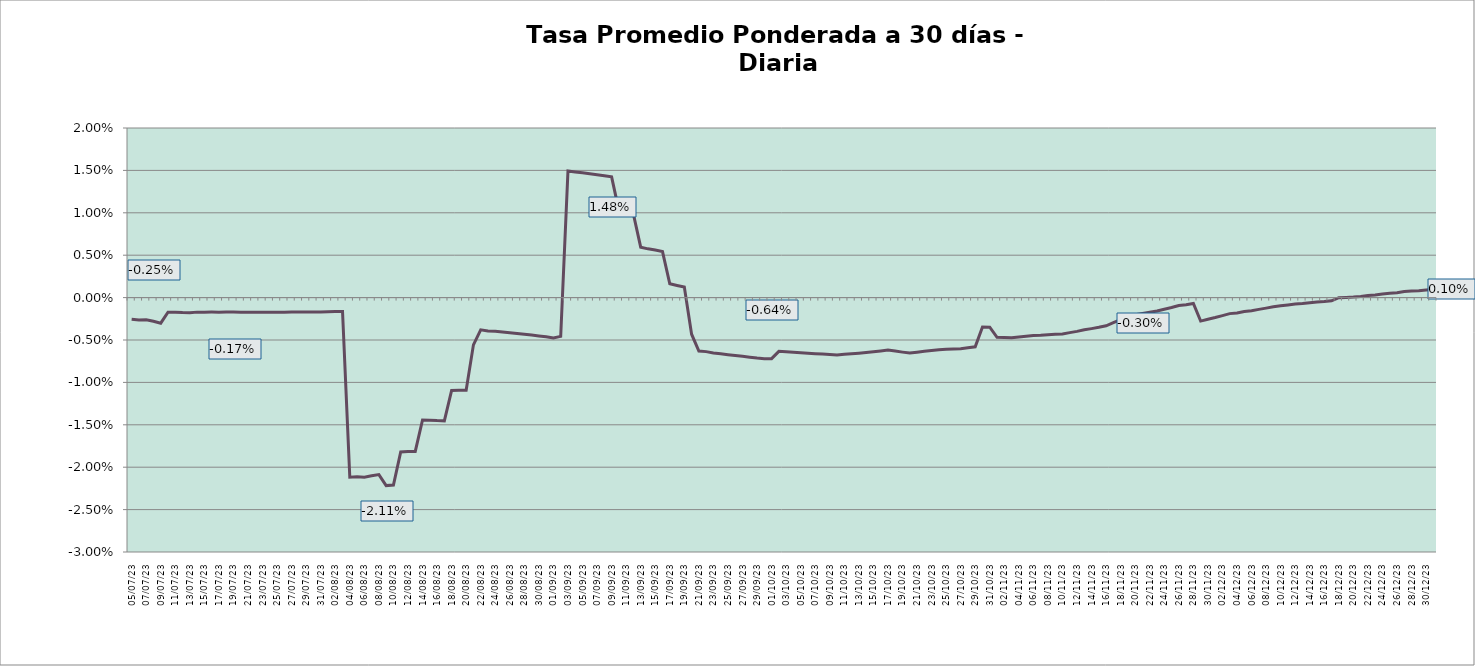
| Category | Tasa a 30 días |
|---|---|
| 2023-07-05 | -0.003 |
| 2023-07-06 | -0.003 |
| 2023-07-07 | -0.003 |
| 2023-07-08 | -0.003 |
| 2023-07-09 | -0.003 |
| 2023-07-10 | -0.002 |
| 2023-07-11 | -0.002 |
| 2023-07-12 | -0.002 |
| 2023-07-13 | -0.002 |
| 2023-07-14 | -0.002 |
| 2023-07-15 | -0.002 |
| 2023-07-16 | -0.002 |
| 2023-07-17 | -0.002 |
| 2023-07-18 | -0.002 |
| 2023-07-19 | -0.002 |
| 2023-07-20 | -0.002 |
| 2023-07-21 | -0.002 |
| 2023-07-22 | -0.002 |
| 2023-07-23 | -0.002 |
| 2023-07-24 | -0.002 |
| 2023-07-25 | -0.002 |
| 2023-07-26 | -0.002 |
| 2023-07-27 | -0.002 |
| 2023-07-28 | -0.002 |
| 2023-07-29 | -0.002 |
| 2023-07-30 | -0.002 |
| 2023-07-31 | -0.002 |
| 2023-08-01 | -0.002 |
| 2023-08-02 | -0.002 |
| 2023-08-03 | -0.002 |
| 2023-08-04 | -0.021 |
| 2023-08-05 | -0.021 |
| 2023-08-06 | -0.021 |
| 2023-08-07 | -0.021 |
| 2023-08-08 | -0.021 |
| 2023-08-09 | -0.022 |
| 2023-08-10 | -0.022 |
| 2023-08-11 | -0.018 |
| 2023-08-12 | -0.018 |
| 2023-08-13 | -0.018 |
| 2023-08-14 | -0.014 |
| 2023-08-15 | -0.014 |
| 2023-08-16 | -0.015 |
| 2023-08-17 | -0.015 |
| 2023-08-18 | -0.011 |
| 2023-08-19 | -0.011 |
| 2023-08-20 | -0.011 |
| 2023-08-21 | -0.006 |
| 2023-08-22 | -0.004 |
| 2023-08-23 | -0.004 |
| 2023-08-24 | -0.004 |
| 2023-08-25 | -0.004 |
| 2023-08-26 | -0.004 |
| 2023-08-27 | -0.004 |
| 2023-08-28 | -0.004 |
| 2023-08-29 | -0.004 |
| 2023-08-30 | -0.005 |
| 2023-08-31 | -0.005 |
| 2023-09-01 | -0.005 |
| 2023-09-02 | -0.005 |
| 2023-09-03 | 0.015 |
| 2023-09-04 | 0.015 |
| 2023-09-05 | 0.015 |
| 2023-09-06 | 0.015 |
| 2023-09-07 | 0.014 |
| 2023-09-08 | 0.014 |
| 2023-09-09 | 0.014 |
| 2023-09-10 | 0.01 |
| 2023-09-11 | 0.01 |
| 2023-09-12 | 0.01 |
| 2023-09-13 | 0.006 |
| 2023-09-14 | 0.006 |
| 2023-09-15 | 0.006 |
| 2023-09-16 | 0.005 |
| 2023-09-17 | 0.002 |
| 2023-09-18 | 0.001 |
| 2023-09-19 | 0.001 |
| 2023-09-20 | -0.004 |
| 2023-09-21 | -0.006 |
| 2023-09-22 | -0.006 |
| 2023-09-23 | -0.007 |
| 2023-09-24 | -0.007 |
| 2023-09-25 | -0.007 |
| 2023-09-26 | -0.007 |
| 2023-09-27 | -0.007 |
| 2023-09-28 | -0.007 |
| 2023-09-29 | -0.007 |
| 2023-09-30 | -0.007 |
| 2023-10-01 | -0.007 |
| 2023-10-02 | -0.006 |
| 2023-10-03 | -0.006 |
| 2023-10-04 | -0.006 |
| 2023-10-05 | -0.006 |
| 2023-10-06 | -0.007 |
| 2023-10-07 | -0.007 |
| 2023-10-08 | -0.007 |
| 2023-10-09 | -0.007 |
| 2023-10-10 | -0.007 |
| 2023-10-11 | -0.007 |
| 2023-10-12 | -0.007 |
| 2023-10-13 | -0.007 |
| 2023-10-14 | -0.006 |
| 2023-10-15 | -0.006 |
| 2023-10-16 | -0.006 |
| 2023-10-17 | -0.006 |
| 2023-10-18 | -0.006 |
| 2023-10-19 | -0.006 |
| 2023-10-20 | -0.007 |
| 2023-10-21 | -0.006 |
| 2023-10-22 | -0.006 |
| 2023-10-23 | -0.006 |
| 2023-10-24 | -0.006 |
| 2023-10-25 | -0.006 |
| 2023-10-26 | -0.006 |
| 2023-10-27 | -0.006 |
| 2023-10-28 | -0.006 |
| 2023-10-29 | -0.006 |
| 2023-10-30 | -0.003 |
| 2023-10-31 | -0.003 |
| 2023-11-01 | -0.005 |
| 2023-11-02 | -0.005 |
| 2023-11-03 | -0.005 |
| 2023-11-04 | -0.005 |
| 2023-11-05 | -0.005 |
| 2023-11-06 | -0.004 |
| 2023-11-07 | -0.004 |
| 2023-11-08 | -0.004 |
| 2023-11-09 | -0.004 |
| 2023-11-10 | -0.004 |
| 2023-11-11 | -0.004 |
| 2023-11-12 | -0.004 |
| 2023-11-13 | -0.004 |
| 2023-11-14 | -0.004 |
| 2023-11-15 | -0.004 |
| 2023-11-16 | -0.003 |
| 2023-11-17 | -0.003 |
| 2023-11-18 | -0.003 |
| 2023-11-19 | -0.002 |
| 2023-11-20 | -0.002 |
| 2023-11-21 | -0.002 |
| 2023-11-22 | -0.002 |
| 2023-11-23 | -0.002 |
| 2023-11-24 | -0.001 |
| 2023-11-25 | -0.001 |
| 2023-11-26 | -0.001 |
| 2023-11-27 | -0.001 |
| 2023-11-28 | -0.001 |
| 2023-11-29 | -0.003 |
| 2023-11-30 | -0.003 |
| 2023-12-01 | -0.002 |
| 2023-12-02 | -0.002 |
| 2023-12-03 | -0.002 |
| 2023-12-04 | -0.002 |
| 2023-12-05 | -0.002 |
| 2023-12-06 | -0.002 |
| 2023-12-07 | -0.001 |
| 2023-12-08 | -0.001 |
| 2023-12-09 | -0.001 |
| 2023-12-10 | -0.001 |
| 2023-12-11 | -0.001 |
| 2023-12-12 | -0.001 |
| 2023-12-13 | -0.001 |
| 2023-12-14 | -0.001 |
| 2023-12-15 | -0.001 |
| 2023-12-16 | 0 |
| 2023-12-17 | 0 |
| 2023-12-18 | 0 |
| 2023-12-19 | 0 |
| 2023-12-20 | 0 |
| 2023-12-21 | 0 |
| 2023-12-22 | 0 |
| 2023-12-23 | 0 |
| 2023-12-24 | 0 |
| 2023-12-25 | 0.001 |
| 2023-12-26 | 0.001 |
| 2023-12-27 | 0.001 |
| 2023-12-28 | 0.001 |
| 2023-12-29 | 0.001 |
| 2023-12-30 | 0.001 |
| 2023-12-31 | 0.001 |